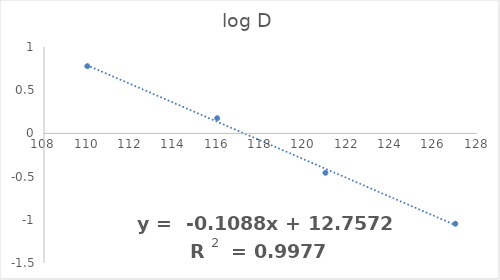
| Category | log D |
|---|---|
| 110.0 | 0.778 |
| 116.0 | 0.176 |
| 121.0 | -0.456 |
| 127.0 | -1.046 |